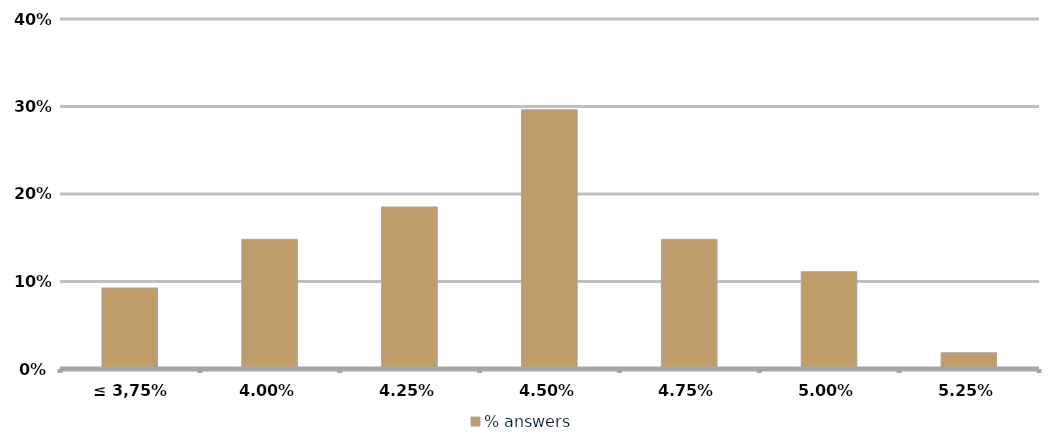
| Category | % answers |
|---|---|
| ≤ 3,75% | 0.093 |
| 4,00% | 0.148 |
| 4,25% | 0.185 |
| 4,50% | 0.296 |
| 4,75% | 0.148 |
| 5,00% | 0.111 |
| 5,25% | 0.019 |